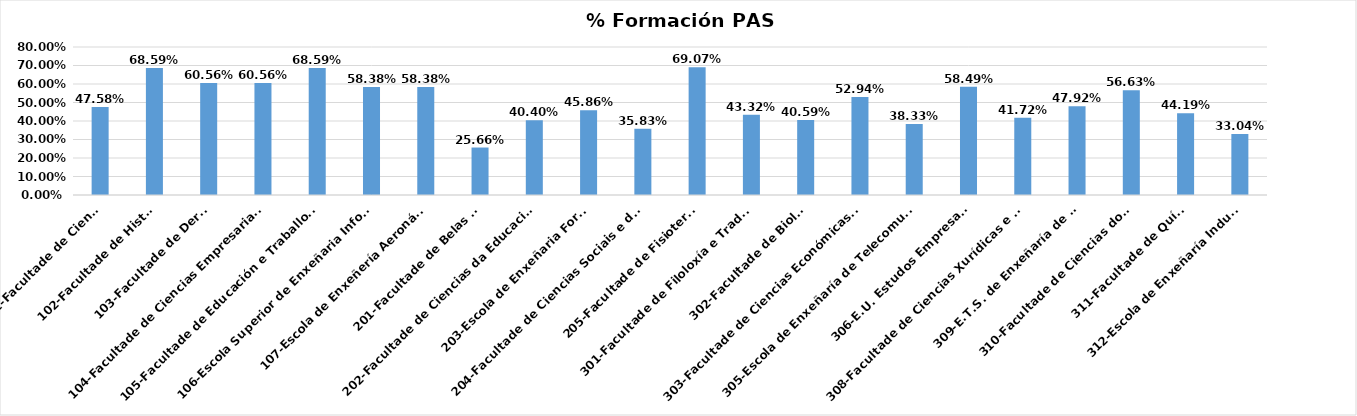
| Category | Series 0 |
|---|---|
| 101-Facultade de Ciencias | 0.476 |
| 102-Facultade de Historia | 0.686 |
| 103-Facultade de Dereito | 0.606 |
| 104-Facultade de Ciencias Empresariais e Turismo | 0.606 |
| 105-Facultade de Educación e Traballo Social | 0.686 |
| 106-Escola Superior de Enxeñaria Informática | 0.584 |
| 107-Escola de Enxeñería Aeronáutica | 0.584 |
| 201-Facultade de Belas Artes | 0.257 |
| 202-Facultade de Ciencias da Educación e do Deporte | 0.404 |
| 203-Escola de Enxeñaria Forestal | 0.459 |
| 204-Facultade de Ciencias Sociais e da Comunicación | 0.358 |
| 205-Facultade de Fisioterapia | 0.691 |
| 301-Facultade de Filoloxía e Traducción | 0.433 |
| 302-Facultade de Bioloxía | 0.406 |
| 303-Facultade de Ciencias Económicas e Empresariais | 0.529 |
| 305-Escola de Enxeñaría de Telecomunicacións | 0.383 |
| 306-E.U. Estudos Empresariais | 0.585 |
| 308-Facultade de Ciencias Xurídicas e do Traballo | 0.417 |
| 309-E.T.S. de Enxeñaría de Minas | 0.479 |
| 310-Facultade de Ciencias do Mar | 0.566 |
| 311-Facultade de Química | 0.442 |
| 312-Escola de Enxeñaría Industrial | 0.33 |